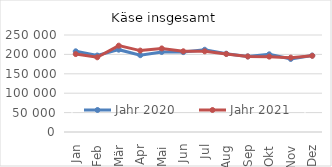
| Category | Jahr 2020 | Jahr 2021 |
|---|---|---|
| 0 | 207965.763 | 200851.152 |
| 1 | 197105.22 | 192564.974 |
| 2 | 212181.68 | 222528.566 |
| 3 | 197977.394 | 209824.396 |
| 4 | 206237.408 | 215337.997 |
| 5 | 205908.042 | 208008.366 |
| 6 | 211955.198 | 207986.565 |
| 7 | 201794.822 | 201042.266 |
| 8 | 194810.25 | 194619.024 |
| 9 | 200224.239 | 194243.524 |
| 10 | 188292.649 | 191657.977 |
| 11 | 197028.825 | 196413.812 |